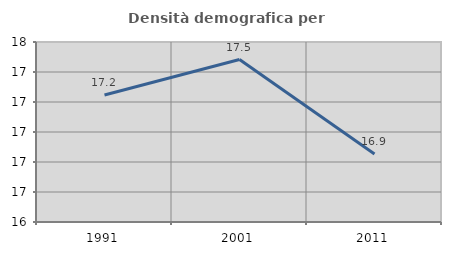
| Category | Densità demografica |
|---|---|
| 1991.0 | 17.247 |
| 2001.0 | 17.483 |
| 2011.0 | 16.853 |